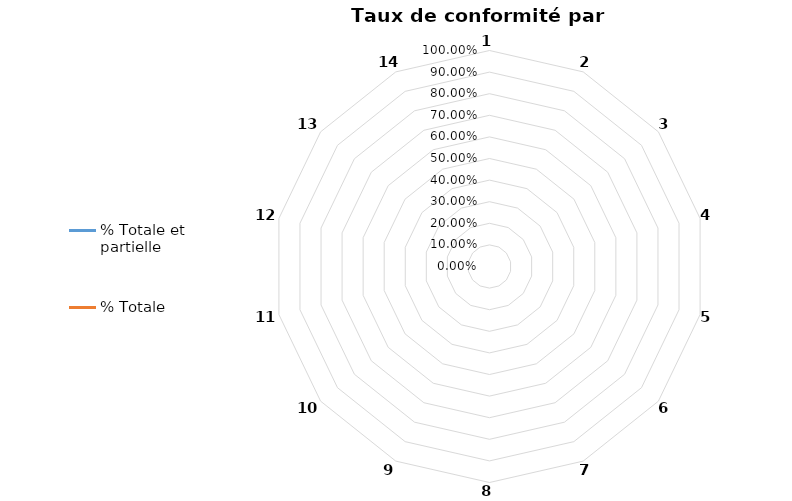
| Category | % Totale et partielle | % Totale |
|---|---|---|
| 0 | 0 | 0 |
| 1 | 0 | 0 |
| 2 | 0 | 0 |
| 3 | 0 | 0 |
| 4 | 0 | 0 |
| 5 | 0 | 0 |
| 6 | 0 | 0 |
| 7 | 0 | 0 |
| 8 | 0 | 0 |
| 9 | 0 | 0 |
| 10 | 0 | 0 |
| 11 | 0 | 0 |
| 12 | 0 | 0 |
| 13 | 0 | 0 |